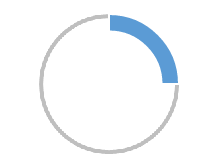
| Category | Series 0 |
|---|---|
| Value | 0.25 |
| Dummy | 0.75 |